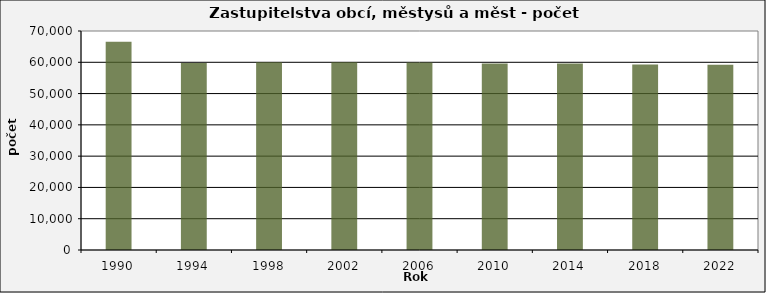
| Category | Počet zastupitelů |
|---|---|
| 1990.0 | 66551 |
| 1994.0 | 59754 |
| 1998.0 | 59986 |
| 2002.0 | 60001 |
| 2006.0 | 59907 |
| 2010.0 | 59633 |
| 2014.0 | 59573 |
| 2018.0 | 59331 |
| 2022.0 | 59228 |